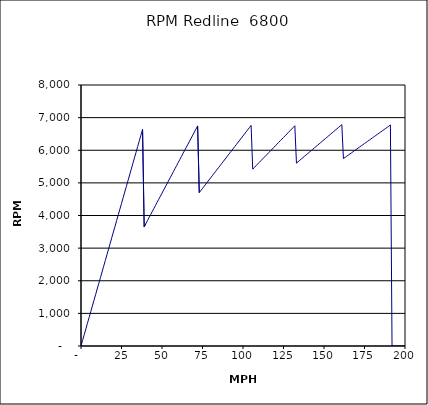
| Category | RPM Redline  6800 |
|---|---|
| 0.0 | 0 |
| 1.0 | 174.709 |
| 2.0 | 349.418 |
| 3.0 | 524.127 |
| 4.0 | 698.836 |
| 5.0 | 873.545 |
| 6.0 | 1048.254 |
| 7.0 | 1222.963 |
| 8.0 | 1397.672 |
| 9.0 | 1572.381 |
| 10.0 | 1747.09 |
| 11.0 | 1921.799 |
| 12.0 | 2096.508 |
| 13.0 | 2271.217 |
| 14.0 | 2445.926 |
| 15.0 | 2620.635 |
| 16.0 | 2795.344 |
| 17.0 | 2970.053 |
| 18.0 | 3144.762 |
| 19.0 | 3319.471 |
| 20.0 | 3494.18 |
| 21.0 | 3668.889 |
| 22.0 | 3843.598 |
| 23.0 | 4018.307 |
| 24.0 | 4193.016 |
| 25.0 | 4367.725 |
| 26.0 | 4542.434 |
| 27.0 | 4717.143 |
| 28.0 | 4891.852 |
| 29.0 | 5066.561 |
| 30.0 | 5241.27 |
| 31.0 | 5415.979 |
| 32.0 | 5590.688 |
| 33.0 | 5765.397 |
| 34.0 | 5940.106 |
| 35.0 | 6114.815 |
| 36.0 | 6289.524 |
| 37.0 | 6464.233 |
| 38.0 | 6638.942 |
| 39.0 | 3654.033 |
| 40.0 | 3747.726 |
| 41.0 | 3841.419 |
| 42.0 | 3935.112 |
| 43.0 | 4028.805 |
| 44.0 | 4122.498 |
| 45.0 | 4216.191 |
| 46.0 | 4309.885 |
| 47.0 | 4403.578 |
| 48.0 | 4497.271 |
| 49.0 | 4590.964 |
| 50.0 | 4684.657 |
| 51.0 | 4778.35 |
| 52.0 | 4872.043 |
| 53.0 | 4965.737 |
| 54.0 | 5059.43 |
| 55.0 | 5153.123 |
| 56.0 | 5246.816 |
| 57.0 | 5340.509 |
| 58.0 | 5434.202 |
| 59.0 | 5527.895 |
| 60.0 | 5621.589 |
| 61.0 | 5715.282 |
| 62.0 | 5808.975 |
| 63.0 | 5902.668 |
| 64.0 | 5996.361 |
| 65.0 | 6090.054 |
| 66.0 | 6183.747 |
| 67.0 | 6277.441 |
| 68.0 | 6371.134 |
| 69.0 | 6464.827 |
| 70.0 | 6558.52 |
| 71.0 | 6652.213 |
| 72.0 | 6745.906 |
| 73.0 | 4701.12 |
| 74.0 | 4765.519 |
| 75.0 | 4829.918 |
| 76.0 | 4894.317 |
| 77.0 | 4958.716 |
| 78.0 | 5023.115 |
| 79.0 | 5087.513 |
| 80.0 | 5151.912 |
| 81.0 | 5216.311 |
| 82.0 | 5280.71 |
| 83.0 | 5345.109 |
| 84.0 | 5409.508 |
| 85.0 | 5473.907 |
| 86.0 | 5538.306 |
| 87.0 | 5602.705 |
| 88.0 | 5667.104 |
| 89.0 | 5731.502 |
| 90.0 | 5795.901 |
| 91.0 | 5860.3 |
| 92.0 | 5924.699 |
| 93.0 | 5989.098 |
| 94.0 | 6053.497 |
| 95.0 | 6117.896 |
| 96.0 | 6182.295 |
| 97.0 | 6246.694 |
| 98.0 | 6311.093 |
| 99.0 | 6375.492 |
| 100.0 | 6439.89 |
| 101.0 | 6504.289 |
| 102.0 | 6568.688 |
| 103.0 | 6633.087 |
| 104.0 | 6697.486 |
| 105.0 | 6761.885 |
| 106.0 | 5420.872 |
| 107.0 | 5472.013 |
| 108.0 | 5523.153 |
| 109.0 | 5574.293 |
| 110.0 | 5625.434 |
| 111.0 | 5676.574 |
| 112.0 | 5727.714 |
| 113.0 | 5778.855 |
| 114.0 | 5829.995 |
| 115.0 | 5881.135 |
| 116.0 | 5932.276 |
| 117.0 | 5983.416 |
| 118.0 | 6034.556 |
| 119.0 | 6085.696 |
| 120.0 | 6136.837 |
| 121.0 | 6187.977 |
| 122.0 | 6239.117 |
| 123.0 | 6290.258 |
| 124.0 | 6341.398 |
| 125.0 | 6392.538 |
| 126.0 | 6443.679 |
| 127.0 | 6494.819 |
| 128.0 | 6545.959 |
| 129.0 | 6597.1 |
| 130.0 | 6648.24 |
| 131.0 | 6699.38 |
| 132.0 | 6750.52 |
| 133.0 | 5605.247 |
| 134.0 | 5647.391 |
| 135.0 | 5689.536 |
| 136.0 | 5731.681 |
| 137.0 | 5773.826 |
| 138.0 | 5815.97 |
| 139.0 | 5858.115 |
| 140.0 | 5900.26 |
| 141.0 | 5942.404 |
| 142.0 | 5984.549 |
| 143.0 | 6026.694 |
| 144.0 | 6068.839 |
| 145.0 | 6110.983 |
| 146.0 | 6153.128 |
| 147.0 | 6195.273 |
| 148.0 | 6237.417 |
| 149.0 | 6279.562 |
| 150.0 | 6321.707 |
| 151.0 | 6363.852 |
| 152.0 | 6405.996 |
| 153.0 | 6448.141 |
| 154.0 | 6490.286 |
| 155.0 | 6532.43 |
| 156.0 | 6574.575 |
| 157.0 | 6616.72 |
| 158.0 | 6658.865 |
| 159.0 | 6701.009 |
| 160.0 | 6743.154 |
| 161.0 | 6785.299 |
| 162.0 | 5744.806 |
| 163.0 | 5780.268 |
| 164.0 | 5815.729 |
| 165.0 | 5851.191 |
| 166.0 | 5886.653 |
| 167.0 | 5922.115 |
| 168.0 | 5957.577 |
| 169.0 | 5993.038 |
| 170.0 | 6028.5 |
| 171.0 | 6063.962 |
| 172.0 | 6099.424 |
| 173.0 | 6134.885 |
| 174.0 | 6170.347 |
| 175.0 | 6205.809 |
| 176.0 | 6241.271 |
| 177.0 | 6276.732 |
| 178.0 | 6312.194 |
| 179.0 | 6347.656 |
| 180.0 | 6383.118 |
| 181.0 | 6418.579 |
| 182.0 | 6454.041 |
| 183.0 | 6489.503 |
| 184.0 | 6524.965 |
| 185.0 | 6560.427 |
| 186.0 | 6595.888 |
| 187.0 | 6631.35 |
| 188.0 | 6666.812 |
| 189.0 | 6702.274 |
| 190.0 | 6737.735 |
| 191.0 | 6773.197 |
| 192.0 | 0 |
| 193.0 | 0 |
| 194.0 | 0 |
| 195.0 | 0 |
| 196.0 | 0 |
| 197.0 | 0 |
| 198.0 | 0 |
| 199.0 | 0 |
| 200.0 | 0 |